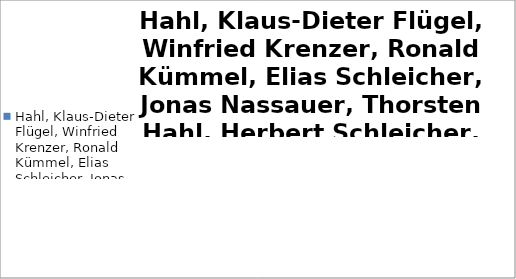
| Category | Hahl, Klaus-Dieter Flügel, Winfried Krenzer, Ronald Kümmel, Elias Schleicher, Jonas Nassauer, Thorsten Hahl, Herbert Schleicher, Peter Heller, Thomas  Leitsch, Martin |
|---|---|
| 0 | 197.38 |
| 1 | 72.99 |
| 2 | 190.09 |
| 3 | 205.63 |
| 4 | 95.5 |
| 5 | 220.14 |
| 6 | 232.57 |
| 7 | 220.56 |
| 8 | 58.977 |
| 9 | 118.77 |